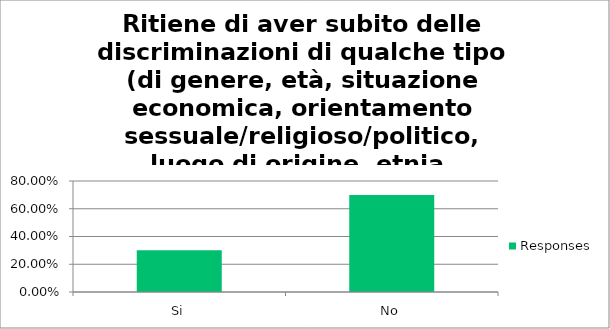
| Category | Responses |
|---|---|
| Si | 0.302 |
| No | 0.698 |